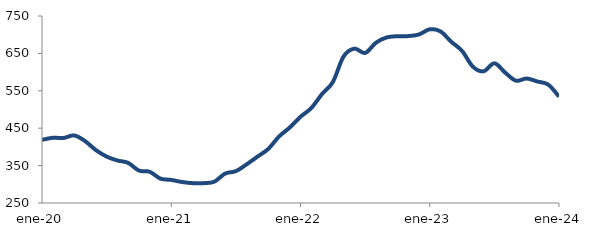
| Category | Series 0 |
|---|---|
| 2020-01-01 | 418.723 |
| 2020-02-01 | 424.322 |
| 2020-03-01 | 423.833 |
| 2020-04-01 | 430.658 |
| 2020-05-01 | 415.426 |
| 2020-06-01 | 391.575 |
| 2020-07-01 | 374.117 |
| 2020-08-01 | 363.638 |
| 2020-09-01 | 357.239 |
| 2020-10-01 | 336.734 |
| 2020-11-01 | 333.458 |
| 2020-12-01 | 315.173 |
| 2021-01-01 | 311.708 |
| 2021-02-01 | 306.103 |
| 2021-03-01 | 303.075 |
| 2021-04-01 | 303.034 |
| 2021-05-01 | 306.996 |
| 2021-06-01 | 328.614 |
| 2021-07-01 | 335.232 |
| 2021-08-01 | 353.414 |
| 2021-09-01 | 373.869 |
| 2021-10-01 | 394.393 |
| 2021-11-01 | 427.592 |
| 2021-12-01 | 451.83 |
| 2022-01-01 | 480.528 |
| 2022-02-01 | 503.882 |
| 2022-03-01 | 541.428 |
| 2022-04-01 | 573.261 |
| 2022-05-01 | 641.774 |
| 2022-06-01 | 662.728 |
| 2022-07-01 | 651.267 |
| 2022-08-01 | 678.506 |
| 2022-09-01 | 692.688 |
| 2022-10-01 | 695.873 |
| 2022-11-01 | 696.235 |
| 2022-12-01 | 700.598 |
| 2023-01-01 | 714.422 |
| 2023-02-01 | 708.75 |
| 2023-03-01 | 680.994 |
| 2023-04-01 | 656.708 |
| 2023-05-01 | 614.698 |
| 2023-06-01 | 602.139 |
| 2023-07-01 | 623.52 |
| 2023-08-01 | 598.686 |
| 2023-09-01 | 577.1 |
| 2023-10-01 | 582.836 |
| 2023-11-01 | 574.767 |
| 2023-12-01 | 566.559 |
| 2024-01-01 | 534.515 |